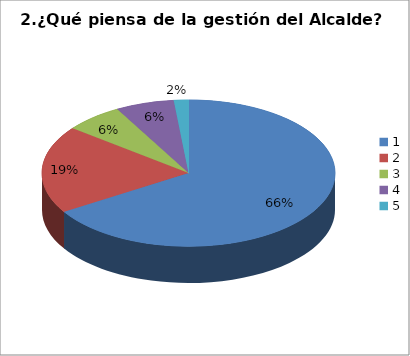
| Category | Series 0 |
|---|---|
| 0 | 41 |
| 1 | 12 |
| 2 | 4 |
| 3 | 4 |
| 4 | 1 |